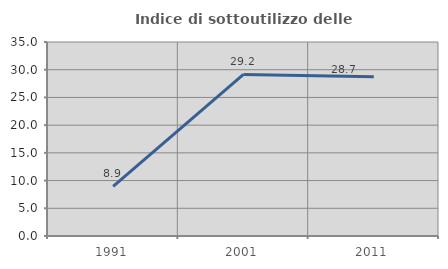
| Category | Indice di sottoutilizzo delle abitazioni  |
|---|---|
| 1991.0 | 8.946 |
| 2001.0 | 29.153 |
| 2011.0 | 28.713 |